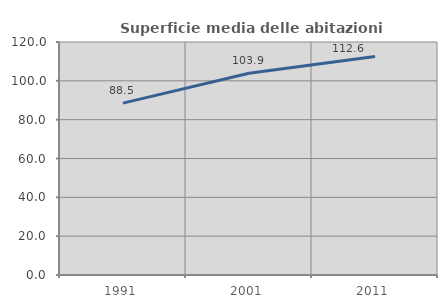
| Category | Superficie media delle abitazioni occupate |
|---|---|
| 1991.0 | 88.537 |
| 2001.0 | 103.866 |
| 2011.0 | 112.56 |